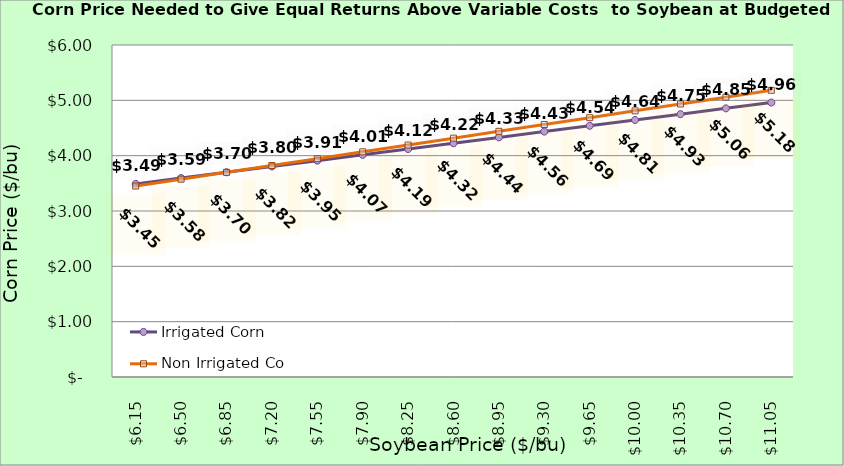
| Category | Irrigated Corn | Non Irrigated Corn |
|---|---|---|
| 6.150000000000002 | 3.49 | 3.452 |
| 6.500000000000002 | 3.595 | 3.575 |
| 6.850000000000001 | 3.7 | 3.699 |
| 7.200000000000001 | 3.805 | 3.822 |
| 7.550000000000001 | 3.91 | 3.946 |
| 7.9 | 4.015 | 4.069 |
| 8.25 | 4.12 | 4.193 |
| 8.6 | 4.225 | 4.316 |
| 8.95 | 4.33 | 4.44 |
| 9.299999999999999 | 4.435 | 4.563 |
| 9.649999999999999 | 4.54 | 4.687 |
| 9.999999999999998 | 4.645 | 4.81 |
| 10.349999999999998 | 4.75 | 4.934 |
| 10.699999999999998 | 4.855 | 5.057 |
| 11.049999999999997 | 4.96 | 5.181 |